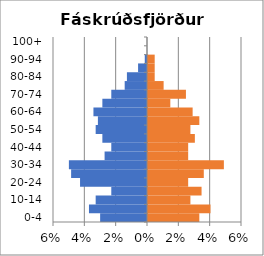
| Category | % Men | % Women |
|---|---|---|
| 0-4 | -0.03 | 0.033 |
| 5-9 | -0.037 | 0.04 |
| 10-14 | -0.033 | 0.027 |
| 15-19 | -0.023 | 0.034 |
| 20-24 | -0.043 | 0.026 |
| 25-29 | -0.048 | 0.036 |
| 30-34 | -0.05 | 0.048 |
| 35-39 | -0.027 | 0.026 |
| 40-44 | -0.023 | 0.026 |
| 45-49 | -0.028 | 0.03 |
| 50-54 | -0.033 | 0.027 |
| 55-59 | -0.031 | 0.033 |
| 60-64 | -0.034 | 0.028 |
| 65-69 | -0.028 | 0.014 |
| 70-74 | -0.023 | 0.024 |
| 75-79 | -0.014 | 0.01 |
| 80-84 | -0.013 | 0.004 |
| 85-89 | -0.006 | 0.004 |
| 90-94 | -0.001 | 0.004 |
| 95-99 | 0 | 0 |
| 100+ | 0 | 0 |